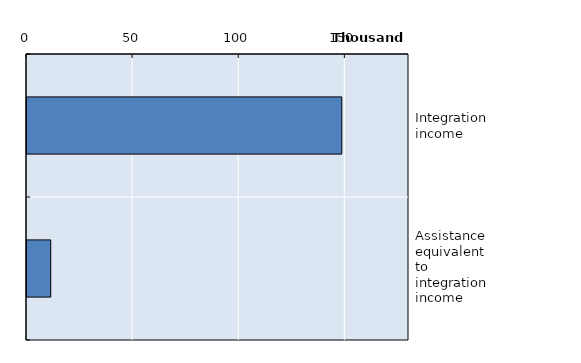
| Category | Series 0 |
|---|---|
| Integration income | 148330 |
| Assistance equivalent to integration income | 11182 |